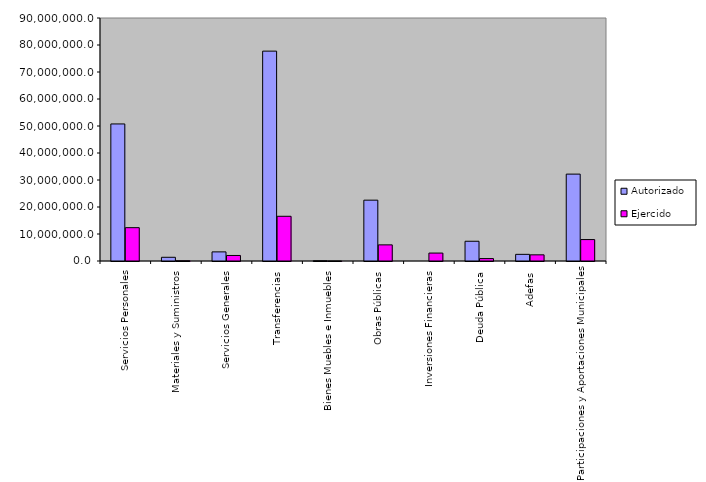
| Category | Autorizado | Ejercido |
|---|---|---|
| Servicios Personales | 50762692.4 | 12344729.6 |
| Materiales y Suministros | 1374426.4 | 84819.3 |
| Servicios Generales | 3377269 | 2043374.1 |
| Transferencias | 77726229.6 | 16556998.7 |
| Bienes Muebles e Inmuebles | 94185.1 | 894 |
| Obras Públicas | 22530860.5 | 5972376.7 |
| Inversiones Financieras | 0 | 2936525.1 |
| Deuda Pública | 7312000 | 899356.4 |
| Adefas | 2460661.3 | 2280943.7 |
| Participaciones y Aportaciones Municipales | 32176712.8 | 7938653.3 |